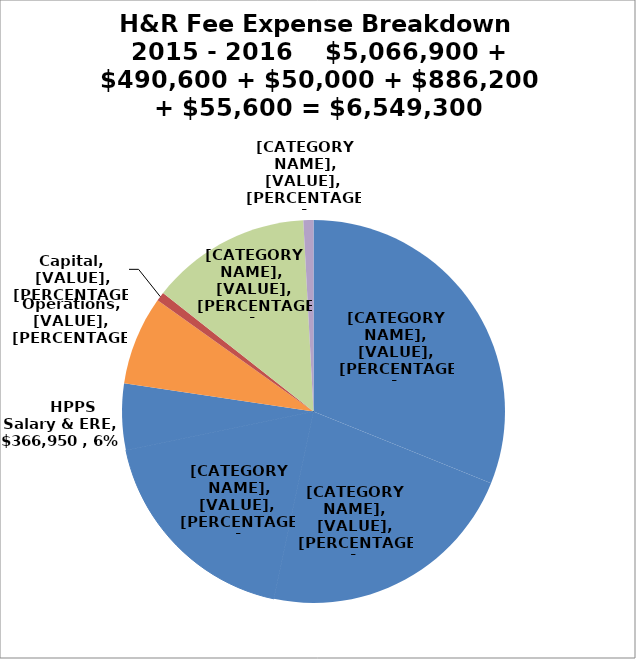
| Category | Series 1 |
|---|---|
|      Medical Salary & ERE | 2037500 |
|      CAPS Salary & ERE | 1454500 |
|      Admin Salary & ERE | 1207950 |
|      HPPS Salary & ERE | 366950 |
|      Operations                   | 490600 |
|      Capital                             | 50000 |
|      SAEM Health & Wellness Transfer  | 886200 |
|      UA ASC Tax | 55600 |